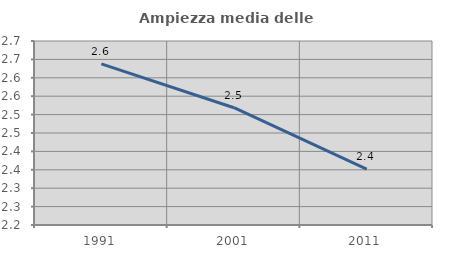
| Category | Ampiezza media delle famiglie |
|---|---|
| 1991.0 | 2.638 |
| 2001.0 | 2.519 |
| 2011.0 | 2.352 |